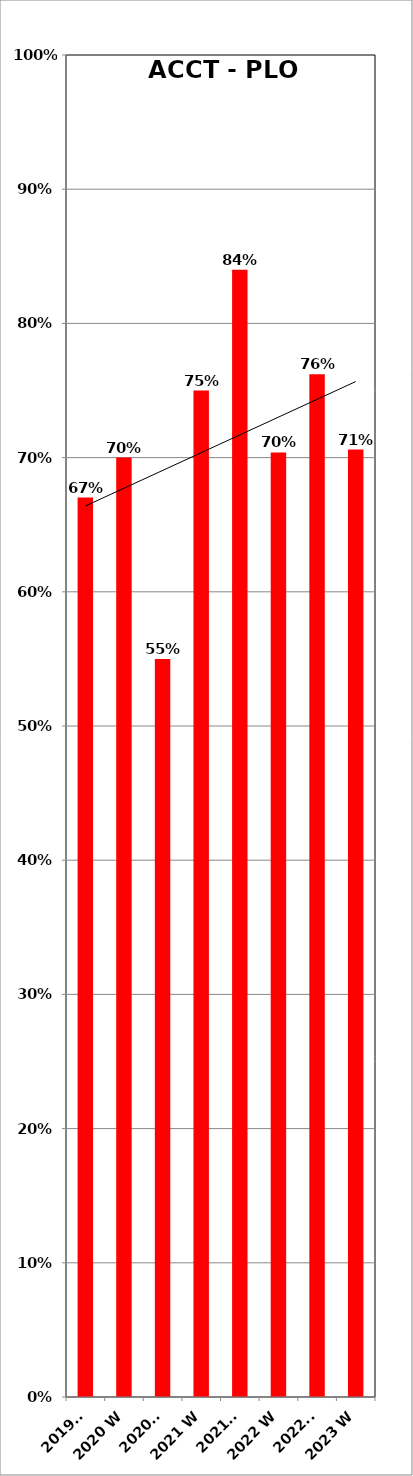
| Category | Series 0 |
|---|---|
| 2019 F | 0.67 |
| 2020 W | 0.7 |
| 2020 F | 0.55 |
| 2021 W | 0.75 |
| 2021 F | 0.84 |
| 2022 W | 0.704 |
| 2022 F | 0.762 |
| 2023 W | 0.706 |